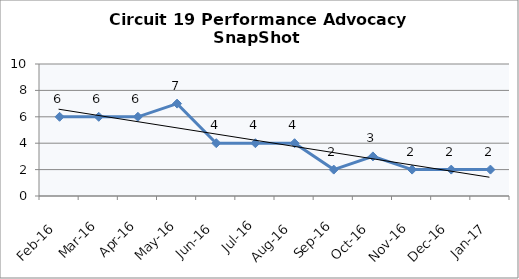
| Category | Circuit 19 |
|---|---|
| Feb-16 | 6 |
| Mar-16 | 6 |
| Apr-16 | 6 |
| May-16 | 7 |
| Jun-16 | 4 |
| Jul-16 | 4 |
| Aug-16 | 4 |
| Sep-16 | 2 |
| Oct-16 | 3 |
| Nov-16 | 2 |
| Dec-16 | 2 |
| Jan-17 | 2 |